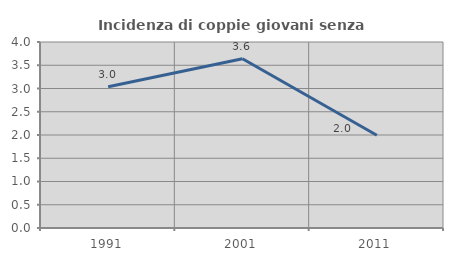
| Category | Incidenza di coppie giovani senza figli |
|---|---|
| 1991.0 | 3.039 |
| 2001.0 | 3.64 |
| 2011.0 | 1.996 |